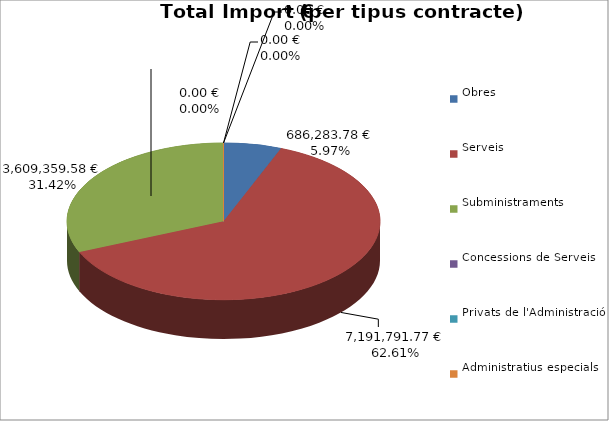
| Category | Total preu
(amb IVA) |
|---|---|
| Obres | 686283.78 |
| Serveis | 7191791.77 |
| Subministraments | 3609359.58 |
| Concessions de Serveis | 0 |
| Privats de l'Administració | 0 |
| Administratius especials | 0 |